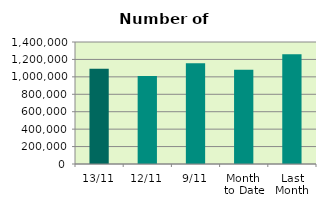
| Category | Series 0 |
|---|---|
| 13/11 | 1092452 |
| 12/11 | 1009044 |
| 9/11 | 1155402 |
| Month 
to Date | 1082173.111 |
| Last
Month | 1260789.391 |